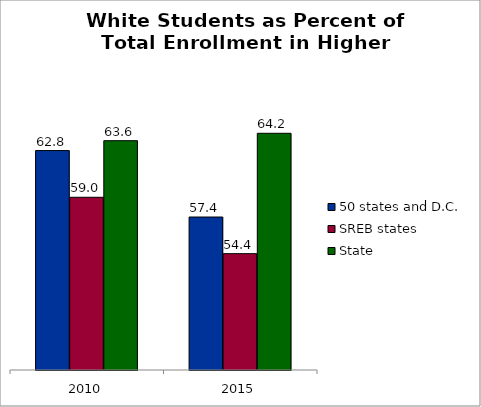
| Category | 50 states and D.C. | SREB states | State |
|---|---|---|---|
| 2010.0 | 62.812 | 59.019 | 63.612 |
| 2015.0 | 57.418 | 54.444 | 64.213 |